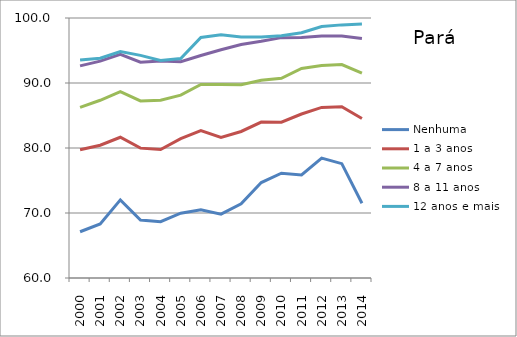
| Category | Nenhuma | 1 a 3 anos | 4 a 7 anos | 8 a 11 anos | 12 anos e mais |
|---|---|---|---|---|---|
| 2000.0 | 67.113 | 79.72 | 86.249 | 92.631 | 93.534 |
| 2001.0 | 68.319 | 80.426 | 87.344 | 93.366 | 93.815 |
| 2002.0 | 72.023 | 81.65 | 88.666 | 94.413 | 94.843 |
| 2003.0 | 68.911 | 79.978 | 87.233 | 93.197 | 94.25 |
| 2004.0 | 68.661 | 79.775 | 87.348 | 93.394 | 93.479 |
| 2005.0 | 69.977 | 81.435 | 88.13 | 93.271 | 93.773 |
| 2006.0 | 70.484 | 82.694 | 89.768 | 94.222 | 97.011 |
| 2007.0 | 69.832 | 81.614 | 89.756 | 95.123 | 97.412 |
| 2008.0 | 71.405 | 82.543 | 89.721 | 95.925 | 97.06 |
| 2009.0 | 74.682 | 83.987 | 90.413 | 96.417 | 97.078 |
| 2010.0 | 76.113 | 83.974 | 90.728 | 96.98 | 97.287 |
| 2011.0 | 75.863 | 85.233 | 92.246 | 96.987 | 97.723 |
| 2012.0 | 78.456 | 86.247 | 92.684 | 97.231 | 98.682 |
| 2013.0 | 77.59 | 86.342 | 92.844 | 97.234 | 98.942 |
| 2014.0 | 71.493 | 84.545 | 91.524 | 96.854 | 99.076 |